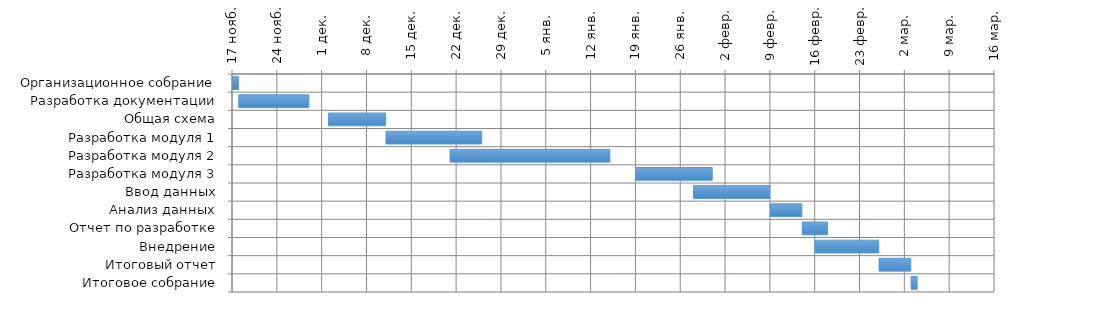
| Category | Начало | Длительность |
|---|---|---|
| Организационное собрание | 11/17/09 | 1 |
| Разработка документации | 11/18/09 | 11 |
| Общая схема | 12/2/09 | 9 |
| Разработка модуля 1 | 12/11/09 | 15 |
| Разработка модуля 2 | 12/21/09 | 25 |
| Разработка модуля 3 | 1/19/10 | 12 |
| Ввод данных | 1/28/10 | 12 |
| Анализ данных | 2/9/10 | 5 |
| Отчет по разработке | 2/14/10 | 4 |
| Внедрение | 2/16/10 | 10 |
| Итоговый отчет | 2/26/10 | 5 |
| Итоговое собрание | 3/3/10 | 1 |